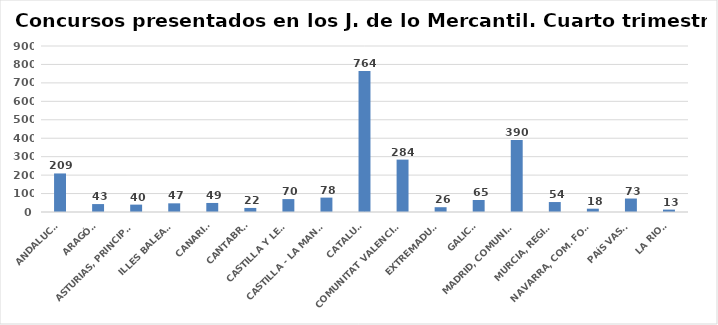
| Category | Series 0 |
|---|---|
| ANDALUCÍA | 209 |
| ARAGÓN | 43 |
| ASTURIAS, PRINCIPADO | 40 |
| ILLES BALEARS | 47 |
| CANARIAS | 49 |
| CANTABRIA | 22 |
| CASTILLA Y LEÓN | 70 |
| CASTILLA - LA MANCHA | 78 |
| CATALUÑA | 764 |
| COMUNITAT VALENCIANA | 284 |
| EXTREMADURA | 26 |
| GALICIA | 65 |
| MADRID, COMUNIDAD | 390 |
| MURCIA, REGIÓN | 54 |
| NAVARRA, COM. FORAL | 18 |
| PAÍS VASCO | 73 |
| LA RIOJA | 13 |